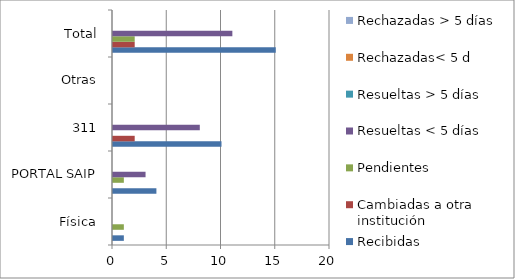
| Category | Recibidas | Cambiadas a otra institución | Pendientes | Resueltas < 5 días | Resueltas > 5 días | Rechazadas< 5 d | Rechazadas > 5 días |
|---|---|---|---|---|---|---|---|
| Física | 1 | 0 | 1 | 0 | 0 | 0 | 0 |
| PORTAL SAIP | 4 | 0 | 1 | 3 | 0 | 0 | 0 |
| 311 | 10 | 2 | 0 | 8 | 0 | 0 | 0 |
| Otras | 0 | 0 | 0 | 0 | 0 | 0 | 0 |
| Total | 15 | 2 | 2 | 11 | 0 | 0 | 0 |